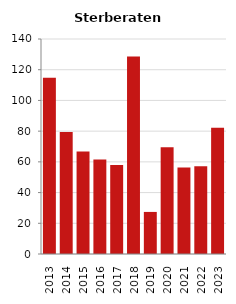
| Category | Sterberate der Bevölkerung ab 80 Jahre (auf Tsd.) |
|---|---|
| 2013.0 | 114.754 |
| 2014.0 | 79.365 |
| 2015.0 | 66.667 |
| 2016.0 | 61.538 |
| 2017.0 | 57.971 |
| 2018.0 | 128.571 |
| 2019.0 | 27.397 |
| 2020.0 | 69.444 |
| 2021.0 | 56.338 |
| 2022.0 | 57.143 |
| 2023.0 | 82.192 |